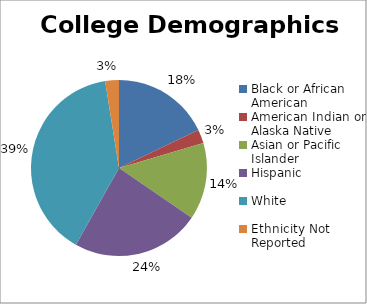
| Category | Black or African American |
|---|---|
| Black or African American | 0.179 |
| American Indian or Alaska Native | 0.025 |
| Asian or Pacific Islander | 0.141 |
| Hispanic | 0.236 |
| White | 0.393 |
| Ethnicity Not Reported | 0.025 |